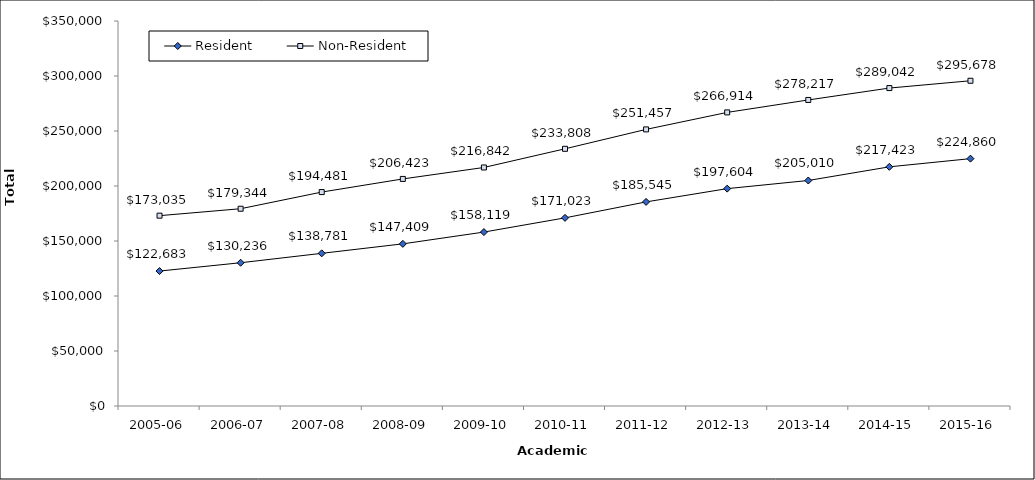
| Category | Resident | Non-Resident |
|---|---|---|
| 2005-06 | 122683 | 173035 |
| 2006-07 | 130236 | 179344 |
| 2007-08 | 138781 | 194481 |
| 2008-09 | 147409 | 206423 |
| 2009-10 | 158119 | 216842 |
| 2010-11 | 171023 | 233808 |
| 2011-12 | 185545 | 251457 |
| 2012-13 | 197604 | 266914 |
| 2013-14 | 205010 | 278217 |
| 2014-15 | 217423 | 289042 |
| 2015-16 | 224860.11 | 295678.13 |